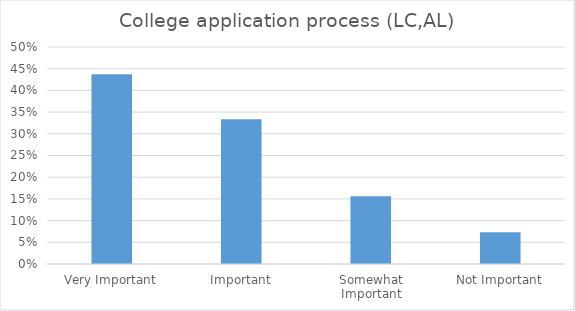
| Category | College application process (LC,AL) |
|---|---|
| Very Important | 0.438 |
| Important | 0.333 |
| Somewhat Important | 0.156 |
| Not Important | 0.073 |